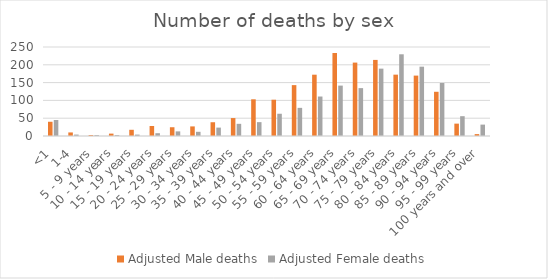
| Category | Adjusted Male deaths | Adjusted Female deaths |
|---|---|---|
| <1 | 40 | 45 |
| 1-4 | 10 | 4 |
| 5 - 9 years | 2.683 | 2.615 |
| 10 - 14 years | 6.707 | 2.615 |
| 15 - 19 years | 17.439 | 3.923 |
| 20 - 24 years | 28.171 | 7.846 |
| 25 - 29 years | 24.601 | 12.976 |
| 30 - 34 years | 26.944 | 11.797 |
| 35 - 39 years | 38.658 | 23.593 |
|  40 - 44 years | 50.373 | 34.211 |
| 45 - 49 years | 103.088 | 38.929 |
| 50 - 54 years | 101.917 | 62.523 |
| 55 - 59 years | 142.918 | 79.038 |
| 60 - 64 years | 172.204 | 110.889 |
| 65 - 69 years | 233.12 | 141.561 |
| 70 - 74 years | 206.177 | 134.483 |
|  75 - 79 years | 213.729 | 189.198 |
| 80 - 84 years | 172.319 | 229.542 |
| 85 - 89 years | 169.647 | 194.763 |
| 90 - 94 years | 124.23 | 148.854 |
| 95 - 99 years | 34.731 | 55.646 |
| 100 years and over | 5.343 | 31.997 |